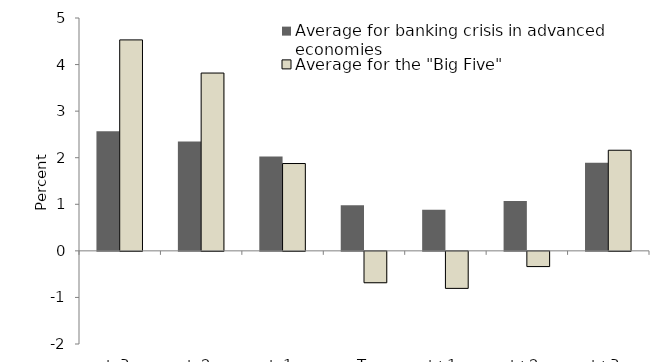
| Category | Average for banking crisis in advanced economies | Average for the "Big Five" |
|---|---|---|
| t–3 | 2.57 | 4.53 |
| t–2 | 2.348 | 3.818 |
| t–1 | 2.028 | 1.875 |
| T | 0.977 | -0.674 |
| t+1 | 0.885 | -0.795 |
| t+2 | 1.069 | -0.327 |
| t+3 | 1.893 | 2.16 |